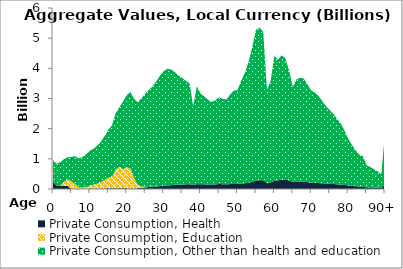
| Category | Private Consumption, Health | Private Consumption, Education | Private Consumption, Other than health and education |
|---|---|---|---|
| 0 | 230.476 | 0 | 724.948 |
|  | 112.441 | 0 | 724.575 |
| 2 | 118.067 | 0 | 775.14 |
| 3 | 97.582 | 140.816 | 754.568 |
| 4 | 96.645 | 221.033 | 735.711 |
| 5 | 5.802 | 244.067 | 810.292 |
| 6 | 6.007 | 166.885 | 912.734 |
| 7 | 6.255 | 44.639 | 962.035 |
| 8 | 6.281 | 44.852 | 1008.356 |
| 9 | 5.802 | 58.848 | 1092.132 |
| 10 | 16.486 | 89.17 | 1159.651 |
| 11 | 17.833 | 127.805 | 1189.726 |
| 12 | 16.883 | 158.28 | 1260.594 |
| 13 | 16.045 | 213.018 | 1340.053 |
| 14 | 18.478 | 283.989 | 1452.337 |
| 15 | 24.129 | 344.365 | 1590.559 |
| 16 | 23.206 | 385.513 | 1707.55 |
| 17 | 24.537 | 626.746 | 1863.45 |
| 18 | 23.906 | 702.439 | 1980.295 |
| 19 | 27.185 | 634.798 | 2241.926 |
| 20 | 20.541 | 703.084 | 2394.1 |
| 21 | 20.54 | 658.928 | 2534.175 |
| 22 | 19.186 | 342.603 | 2621.466 |
| 23 | 29.252 | 104.714 | 2737.01 |
| 24 | 41.735 | 45.278 | 2934.079 |
| 25 | 54.863 | 19.845 | 3081.121 |
| 26 | 65.868 | 1.573 | 3223 |
| 27 | 76.784 | 5.074 | 3324.779 |
| 28 | 86.876 | 1.39 | 3481.037 |
| 29 | 96.061 | 0.358 | 3657.918 |
| 30 | 110.104 | 2.055 | 3797.363 |
| 31 | 120.05 | 0.344 | 3867.711 |
| 32 | 127.848 | 1.52 | 3831.27 |
| 33 | 133.263 | 4.796 | 3744.936 |
| 34 | 141.41 | 2.491 | 3613.048 |
| 35 | 145.639 | 1.163 | 3542.24 |
| 36 | 152.8 | 0.257 | 3431.316 |
| 37 | 162.711 | 2.899 | 3347.502 |
| 38 | 129.251 | 0 | 2624.268 |
| 39 | 162.873 | 0.236 | 3244.896 |
| 40 | 153.585 | 0 | 3007.52 |
| 41 | 154.323 | 0.059 | 2916.575 |
| 42 | 149.762 | 0 | 2806.668 |
| 43 | 149.766 | 0.677 | 2739.232 |
| 44 | 153.838 | 0.553 | 2779.438 |
| 45 | 165.651 | 0.576 | 2878.618 |
| 46 | 159.98 | 3.01 | 2824.255 |
| 47 | 153.533 | 0 | 2811.401 |
| 48 | 163.089 | 0 | 2966.883 |
| 49 | 168.491 | 0 | 3091.93 |
| 50 | 165.537 | 0 | 3109.38 |
| 51 | 176.874 | 2.184 | 3409.172 |
| 52 | 189.842 | 0.194 | 3652.924 |
| 53 | 208.86 | 0.157 | 3998.782 |
| 54 | 237.028 | 0 | 4451.665 |
| 55 | 277.48 | 0 | 4996.076 |
| 56 | 292.288 | 0 | 5061.317 |
| 57 | 292.422 | 0 | 4912.025 |
| 58 | 190.686 | 0.114 | 3097.397 |
| 59 | 217.554 | 0 | 3362.183 |
| 60 | 271.871 | 0 | 4133.923 |
| 61 | 285.108 | 0 | 4007.008 |
| 62 | 310.232 | 0.546 | 4119.093 |
| 63 | 308.238 | 0 | 4025.735 |
| 64 | 278.854 | 0.013 | 3646.483 |
| 65 | 241.798 | 0.006 | 3143.792 |
| 66 | 252.69 | 0.021 | 3374.08 |
| 67 | 251.677 | 0.098 | 3445.551 |
| 68 | 242.744 | 0 | 3414.268 |
| 69 | 226.986 | 0 | 3242.179 |
| 70 | 209.715 | 0 | 3054.787 |
| 71 | 201.508 | 0 | 2992.263 |
| 72 | 195.536 | 0 | 2888.485 |
| 73 | 190.785 | 0 | 2725.067 |
| 74 | 179.359 | 0 | 2561.819 |
| 75 | 170.031 | 0 | 2452.681 |
| 76 | 166.709 | 0.011 | 2327.413 |
| 77 | 152.879 | 0 | 2170.033 |
| 78 | 143.007 | 0 | 2034.325 |
| 79 | 133.701 | 0 | 1810.729 |
| 80 | 120.924 | 0 | 1549.88 |
| 81 | 104.348 | 0 | 1364.725 |
| 82 | 92.859 | 0 | 1198.027 |
| 83 | 80.875 | 0 | 1062.045 |
| 84 | 73.663 | 0 | 1013.149 |
| 85 | 54.585 | 0 | 736.308 |
| 86 | 51.236 | 0 | 679.358 |
| 87 | 46.335 | 0 | 610.695 |
| 88 | 41.661 | 0 | 542.21 |
| 89 | 35.716 | 0 | 459.074 |
| 90+ | 135.709 | 0 | 1722.45 |